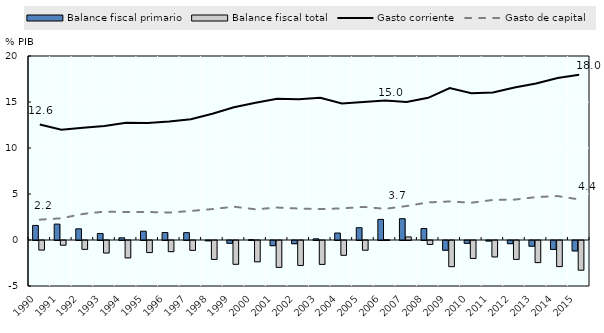
| Category | Balance fiscal primario | Balance fiscal total |
|---|---|---|
| 0 | 1.585 | -1.039 |
| 1 | 1.727 | -0.513 |
| 2 | 1.215 | -0.962 |
| 3 | 0.709 | -1.36 |
| 4 | 0.237 | -1.894 |
| 5 | 0.957 | -1.314 |
| 6 | 0.811 | -1.213 |
| 7 | 0.798 | -1.071 |
| 8 | -0.032 | -2.06 |
| 9 | -0.303 | -2.588 |
| 10 | 0.042 | -2.318 |
| 11 | -0.561 | -2.92 |
| 12 | -0.348 | -2.712 |
| 13 | 0.129 | -2.598 |
| 14 | 0.76 | -1.609 |
| 15 | 1.336 | -1.053 |
| 16 | 2.24 | 0.027 |
| 17 | 2.316 | 0.333 |
| 18 | 1.249 | -0.427 |
| 19 | -1.058 | -2.842 |
| 20 | -0.309 | -1.95 |
| 21 | -0.056 | -1.788 |
| 22 | -0.342 | -2.055 |
| 23 | -0.618 | -2.402 |
| 24 | -0.971 | -2.835 |
| 25 | -1.133 | -3.227 |